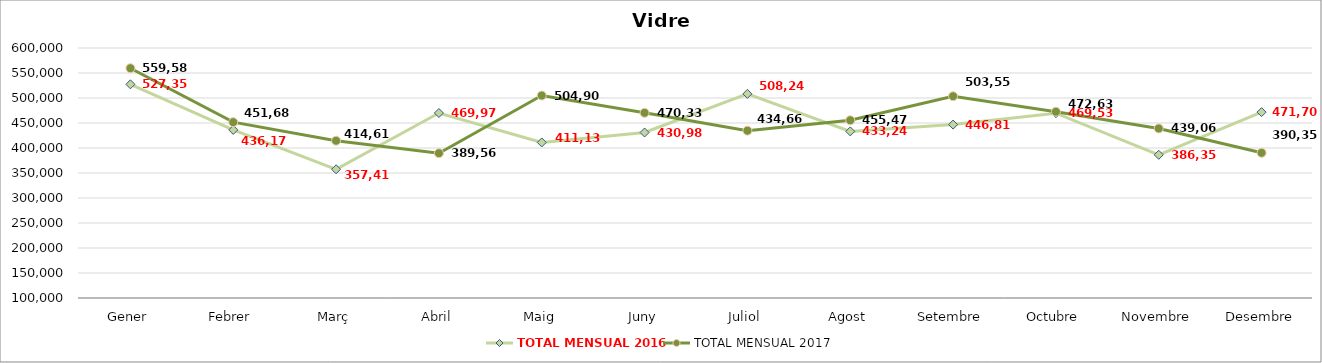
| Category | TOTAL MENSUAL 2016 | TOTAL MENSUAL 2017 |
|---|---|---|
| Gener | 527356.52 | 559580.07 |
| Febrer | 436171.71 | 451688.21 |
| Març | 357415.37 | 414615.522 |
| Abril | 469977.98 | 389566.03 |
| Maig | 411134.16 | 504903.06 |
| Juny | 430986.08 | 470333.39 |
| Juliol | 508245.79 | 434660.92 |
| Agost | 433242.19 | 455474.09 |
| Setembre | 446818.56 | 503550.18 |
| Octubre | 469532.32 | 472635.17 |
| Novembre | 386356.85 | 439065.19 |
| Desembre | 471705.35 | 390351.32 |